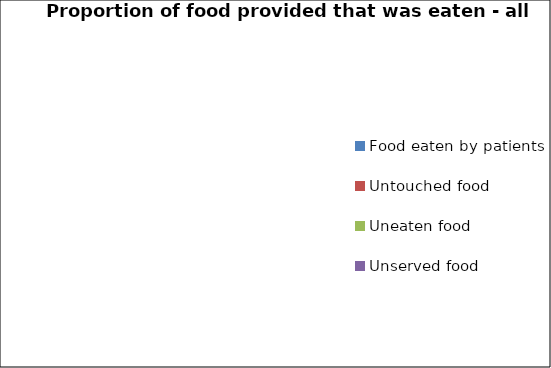
| Category | Proportion of food provided that was eaten - all meals |
|---|---|
| Food eaten by patients | 0 |
| Untouched food | 0 |
| Uneaten food | 0 |
| Unserved food | 0 |